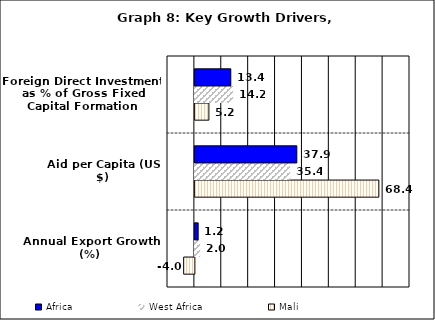
| Category | Mali | West Africa | Africa |
|---|---|---|---|
| Annual Export Growth (%) | -3.98 | 1.951 | 1.219 |
| Aid per Capita (US $) | 68.418 | 35.416 | 37.904 |
| Foreign Direct Investment as % of Gross Fixed Capital Formation | 5.209 | 14.214 | 13.354 |